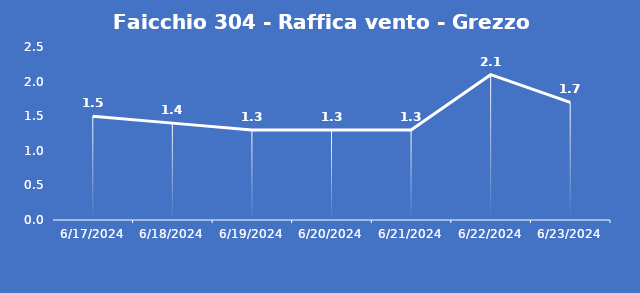
| Category | Faicchio 304 - Raffica vento - Grezzo (m/s) |
|---|---|
| 6/17/24 | 1.5 |
| 6/18/24 | 1.4 |
| 6/19/24 | 1.3 |
| 6/20/24 | 1.3 |
| 6/21/24 | 1.3 |
| 6/22/24 | 2.1 |
| 6/23/24 | 1.7 |